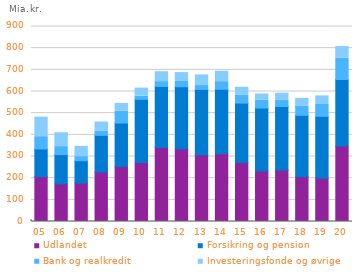
| Category | Udlandet | Forsikring og pension | Bank og realkredit | Investeringsfonde og øvrige |
|---|---|---|---|---|
| 05 | 207.113 | 127.901 | 56.654 | 90.118 |
| 06 | 173.654 | 135.194 | 36.895 | 64.079 |
| 07 | 177.786 | 102.584 | 19.192 | 47.138 |
| 08 | 228.507 | 169.349 | 19.088 | 42.328 |
| 09 | 253.658 | 201 | 54.83 | 35.197 |
| 10 | 272.274 | 291.751 | 14.509 | 37.204 |
| 11 | 341.481 | 281.908 | 22.425 | 45.503 |
| 12 | 335.508 | 286.387 | 27.24 | 38.193 |
| 13 | 308.478 | 301.074 | 17.956 | 49.158 |
| 14 | 312.623 | 297.506 | 35.381 | 48.088 |
| 15 | 272.6 | 273.923 | 37.44 | 35.551 |
| 16 | 233.212 | 290.606 | 35.898 | 28.722 |
| 17 | 237.526 | 293.177 | 30.198 | 31.348 |
| 18 | 207.136 | 283.11 | 43.398 | 34.808 |
| 19 | 199.752 | 285.76 | 54.553 | 39.672 |
| 20 | 348.763 | 306.613 | 98.266 | 53.525 |